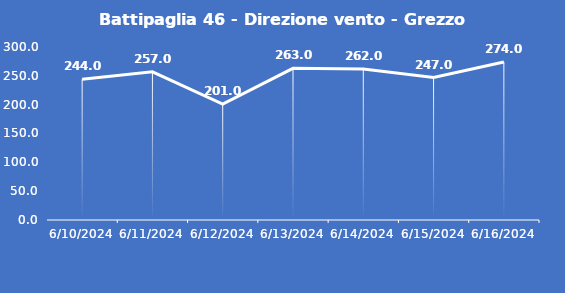
| Category | Battipaglia 46 - Direzione vento - Grezzo (°N) |
|---|---|
| 6/10/24 | 244 |
| 6/11/24 | 257 |
| 6/12/24 | 201 |
| 6/13/24 | 263 |
| 6/14/24 | 262 |
| 6/15/24 | 247 |
| 6/16/24 | 274 |